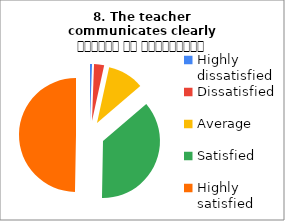
| Category | 8. The teacher communicates clearly शिक्षक का सम्प्रेषण सुस्पष्ट है |
|---|---|
| Highly dissatisfied | 1 |
| Dissatisfied | 5 |
| Average | 18 |
| Satisfied | 64 |
| Highly satisfied | 87 |